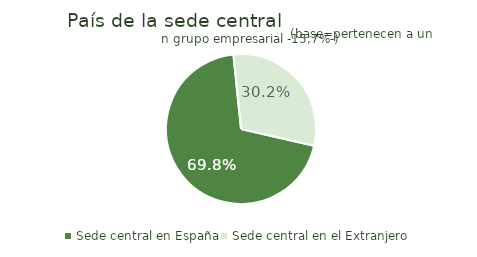
| Category | Series 0 |
|---|---|
| Sede central en España | 0.698 |
| Sede central en el Extranjero | 0.302 |